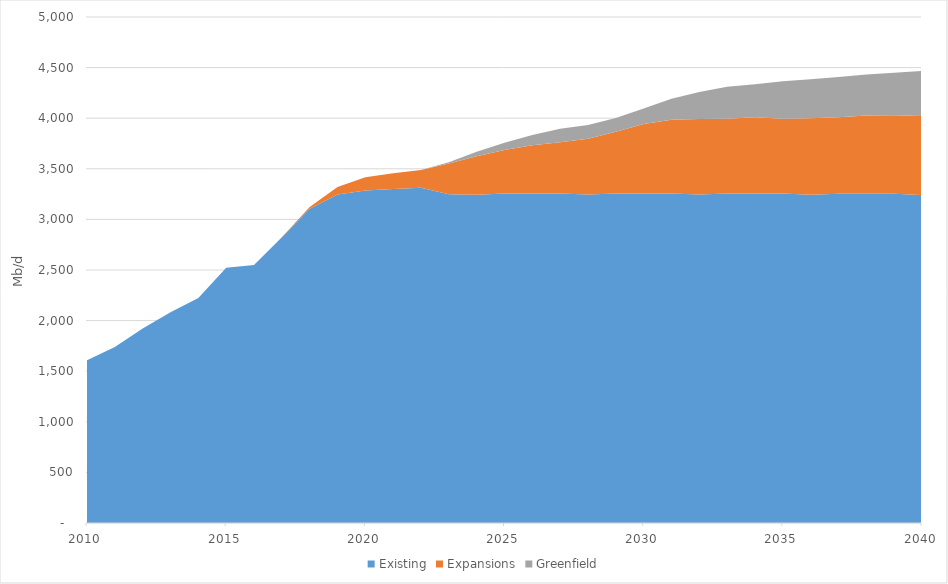
| Category | Existing | Expansions | Greenfield |
|---|---|---|---|
| 2010.0 | 1609.385 | 0 | 0 |
| 2011.0 | 1739.876 | 0 | 0 |
| 2012.0 | 1922.172 | 0 | 0 |
| 2013.0 | 2082.158 | 0 | 0 |
| 2014.0 | 2222.828 | 0 | 0 |
| 2015.0 | 2523.264 | 0 | 0 |
| 2016.0 | 2548.251 | 0 | 0 |
| 2017.0 | 2822.426 | 0 | 0 |
| 2018.0 | 3105.397 | 17.113 | 0 |
| 2019.0 | 3245.923 | 74.549 | 0 |
| 2020.0 | 3285.294 | 131.95 | 0 |
| 2021.0 | 3300.131 | 155.161 | 0 |
| 2022.0 | 3311.732 | 176.02 | 0 |
| 2023.0 | 3247.745 | 305.844 | 12.105 |
| 2024.0 | 3243.76 | 380.137 | 43.69 |
| 2025.0 | 3256.358 | 429.266 | 72.131 |
| 2026.0 | 3256.434 | 475.261 | 101.55 |
| 2027.0 | 3256.432 | 506.45 | 132.174 |
| 2028.0 | 3246.274 | 550.346 | 135.441 |
| 2029.0 | 3256.429 | 609.114 | 135.865 |
| 2030.0 | 3256.426 | 686.392 | 153.666 |
| 2031.0 | 3256.381 | 728.561 | 207.77 |
| 2032.0 | 3246.086 | 747.153 | 266.168 |
| 2033.0 | 3256.005 | 739.549 | 315.348 |
| 2034.0 | 3255.671 | 753.528 | 326.19 |
| 2035.0 | 3255.241 | 738.144 | 370.64 |
| 2036.0 | 3244.563 | 753.844 | 385.258 |
| 2037.0 | 3254.094 | 756.287 | 397.173 |
| 2038.0 | 3253.379 | 772.911 | 404.299 |
| 2039.0 | 3252.572 | 776.441 | 419.832 |
| 2040.0 | 3241.535 | 780.952 | 444.756 |